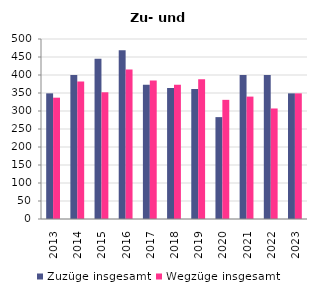
| Category | Zuzüge insgesamt | Wegzüge insgesamt |
|---|---|---|
| 2013.0 | 349 | 337 |
| 2014.0 | 400 | 382 |
| 2015.0 | 445 | 352 |
| 2016.0 | 469 | 415 |
| 2017.0 | 373 | 385 |
| 2018.0 | 364 | 373 |
| 2019.0 | 361 | 388 |
| 2020.0 | 283 | 331 |
| 2021.0 | 400 | 340 |
| 2022.0 | 400 | 307 |
| 2023.0 | 349 | 349 |